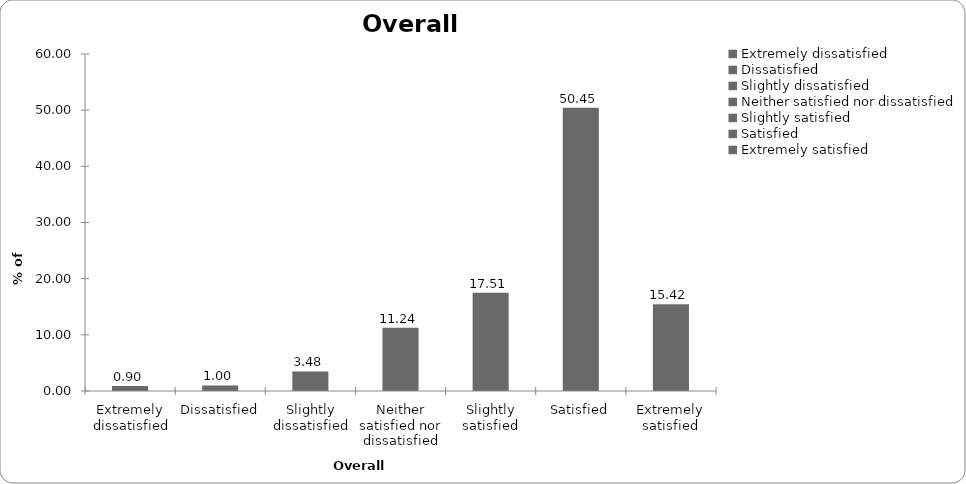
| Category | Overall satisfaction |
|---|---|
| Extremely dissatisfied | 0.896 |
| Dissatisfied | 0.995 |
| Slightly dissatisfied | 3.483 |
| Neither satisfied nor dissatisfied | 11.244 |
| Slightly satisfied | 17.512 |
| Satisfied | 50.448 |
| Extremely satisfied | 15.423 |